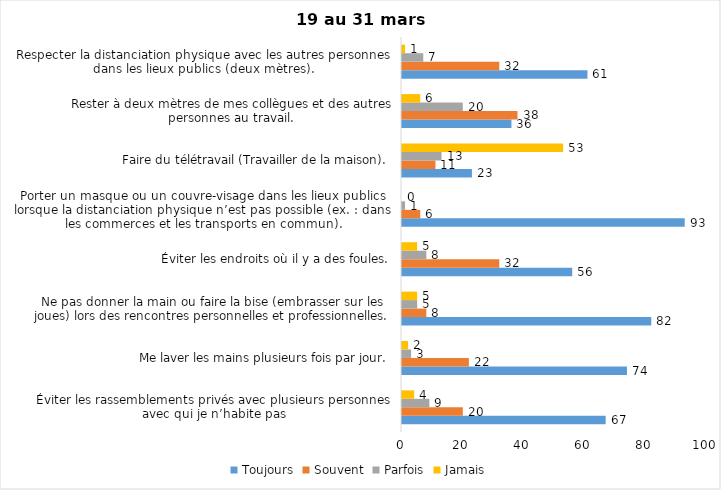
| Category | Toujours | Souvent | Parfois | Jamais |
|---|---|---|---|---|
| Éviter les rassemblements privés avec plusieurs personnes avec qui je n’habite pas | 67 | 20 | 9 | 4 |
| Me laver les mains plusieurs fois par jour. | 74 | 22 | 3 | 2 |
| Ne pas donner la main ou faire la bise (embrasser sur les joues) lors des rencontres personnelles et professionnelles. | 82 | 8 | 5 | 5 |
| Éviter les endroits où il y a des foules. | 56 | 32 | 8 | 5 |
| Porter un masque ou un couvre-visage dans les lieux publics lorsque la distanciation physique n’est pas possible (ex. : dans les commerces et les transports en commun). | 93 | 6 | 1 | 0 |
| Faire du télétravail (Travailler de la maison). | 23 | 11 | 13 | 53 |
| Rester à deux mètres de mes collègues et des autres personnes au travail. | 36 | 38 | 20 | 6 |
| Respecter la distanciation physique avec les autres personnes dans les lieux publics (deux mètres). | 61 | 32 | 7 | 1 |